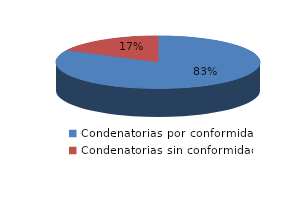
| Category | Series 0 |
|---|---|
| 0 | 19 |
| 1 | 4 |